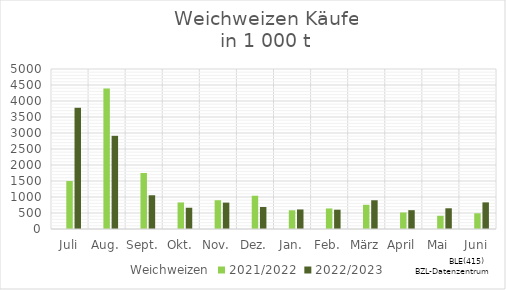
| Category | Weichweizen | 2021/2022 | 2022/2023 |
|---|---|---|---|
| Juli |  | 1498.429 | 3788.049 |
| Aug. |  | 4393.017 | 2912.196 |
| Sept. |  | 1750.015 | 1054.311 |
| Okt. |  | 830.069 | 664.246 |
| Nov. |  | 899.173 | 825.092 |
| Dez. |  | 1040.195 | 687.733 |
| Jan. |  | 584.815 | 610.38 |
| Feb. |  | 642.101 | 602.575 |
| März |  | 756.94 | 898.483 |
| April |  | 516.477 | 588.283 |
| Mai |  | 413.279 | 647.374 |
| Juni |  | 490.445 | 832.135 |